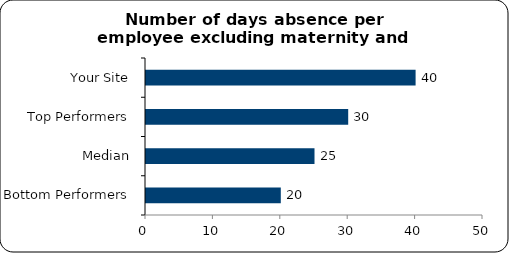
| Category | Number of days absence per employee excluding maternity and paternity leave |
|---|---|
| Bottom Performers | 20 |
| Median | 25 |
| Top Performers | 30 |
| Your Site | 40 |